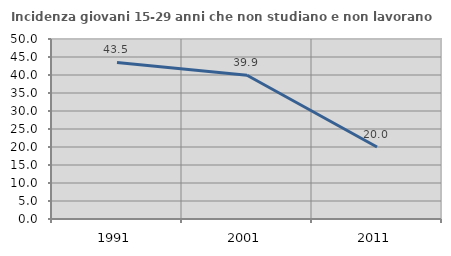
| Category | Incidenza giovani 15-29 anni che non studiano e non lavorano  |
|---|---|
| 1991.0 | 43.477 |
| 2001.0 | 39.924 |
| 2011.0 | 20 |